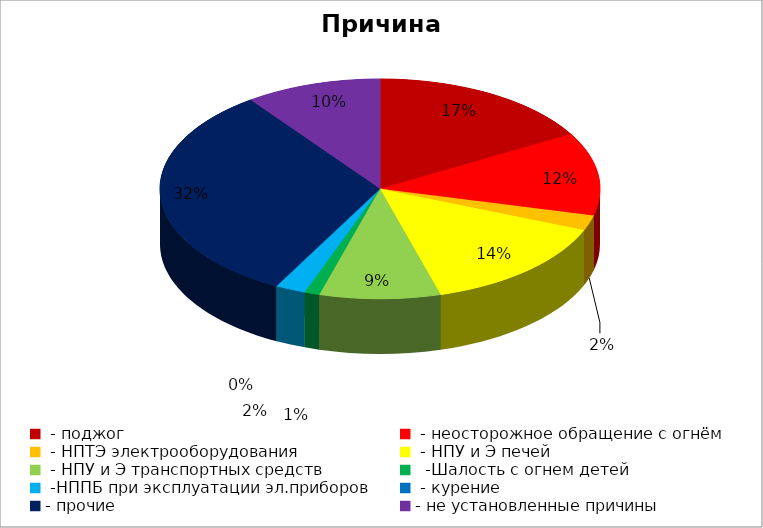
| Category | Причина пожара |
|---|---|
|  - поджог | 15 |
|  - неосторожное обращение с огнём | 11 |
|  - НПТЭ электрооборудования | 2 |
|  - НПУ и Э печей | 13 |
|  - НПУ и Э транспортных средств | 8 |
|   -Шалость с огнем детей | 1 |
|  -НППБ при эксплуатации эл.приборов | 2 |
|  - курение | 0 |
| - прочие | 29 |
| - не установленные причины | 9 |